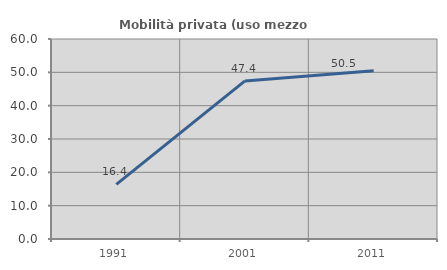
| Category | Mobilità privata (uso mezzo privato) |
|---|---|
| 1991.0 | 16.379 |
| 2001.0 | 47.423 |
| 2011.0 | 50.459 |